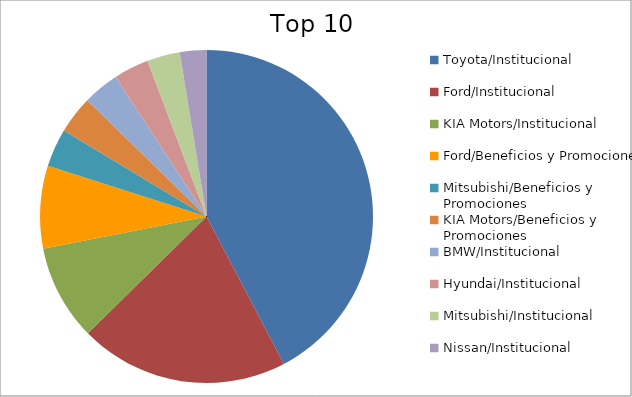
| Category | Series 0 |
|---|---|
| Toyota/Institucional | 36.13 |
| Ford/Institucional | 17.35 |
| KIA Motors/Institucional | 7.92 |
| Ford/Beneficios y Promociones | 6.85 |
| Mitsubishi/Beneficios y Promociones | 3.17 |
| KIA Motors/Beneficios y Promociones | 3.14 |
| BMW/Institucional | 2.99 |
| Hyundai/Institucional | 2.92 |
| Mitsubishi/Institucional | 2.73 |
| Nissan/Institucional | 2.2 |